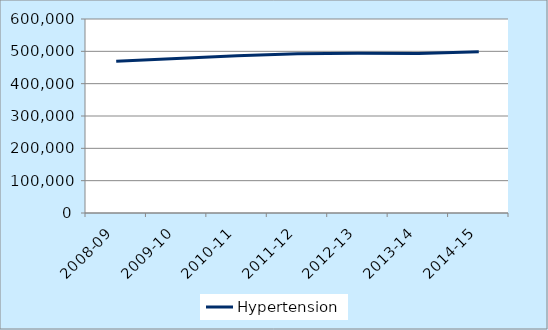
| Category | Hypertension |
|---|---|
| 2008-09 | 469518 |
| 2009-10 | 478067 |
| 2010-11 | 486533 |
| 2011-12 | 492386 |
| 2012-13 | 493981 |
| 2013-14 | 493103 |
| 2014-15 | 498553 |